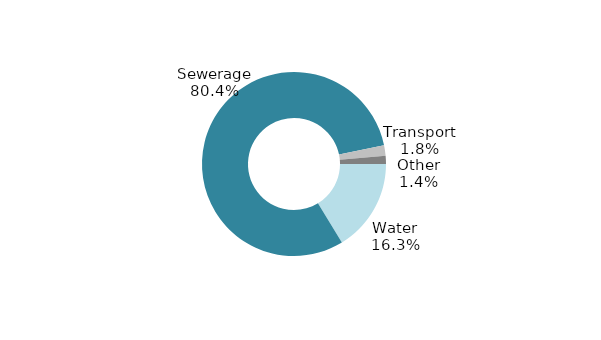
| Category | Series 3 |
|---|---|
| Water | 0.163 |
| Sewerage | 0.804 |
| Transport | 0.018 |
| Other | 0.014 |